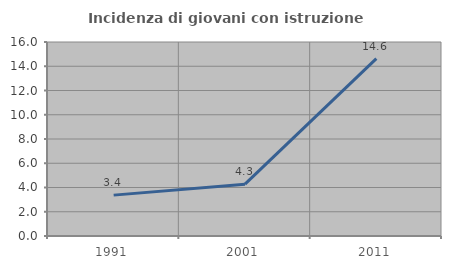
| Category | Incidenza di giovani con istruzione universitaria |
|---|---|
| 1991.0 | 3.371 |
| 2001.0 | 4.274 |
| 2011.0 | 14.634 |